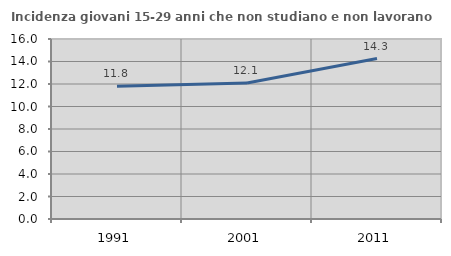
| Category | Incidenza giovani 15-29 anni che non studiano e non lavorano  |
|---|---|
| 1991.0 | 11.792 |
| 2001.0 | 12.088 |
| 2011.0 | 14.259 |